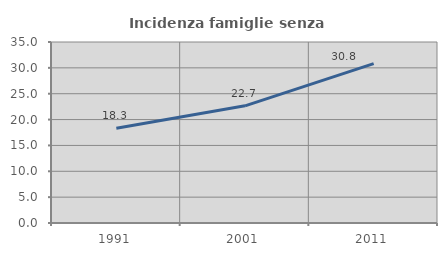
| Category | Incidenza famiglie senza nuclei |
|---|---|
| 1991.0 | 18.302 |
| 2001.0 | 22.655 |
| 2011.0 | 30.829 |